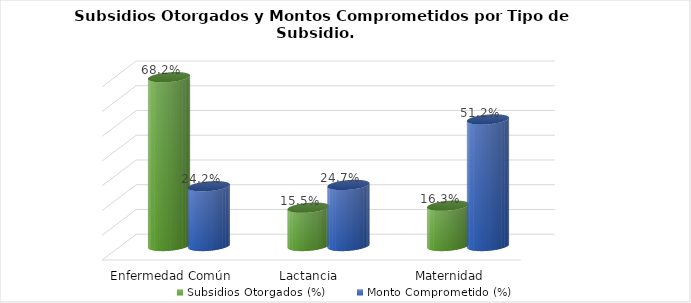
| Category | Subsidios Otorgados (%) | Monto Comprometido (%) |
|---|---|---|
| Enfermedad Común | 0.682 | 0.242 |
| Lactancia  | 0.155 | 0.247 |
| Maternidad | 0.163 | 0.512 |